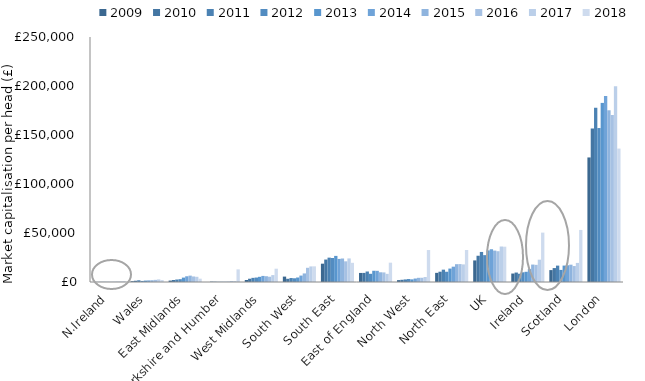
| Category | 2009 | 2010 | 2011 | 2012 | 2013 | 2014 | 2015 | 2016 | 2017 | 2018 |
|---|---|---|---|---|---|---|---|---|---|---|
| N.Ireland | 65.147 | 106.695 | 171.606 | 189.431 | 168.078 | 165.638 | 243.991 | 382.003 | 509.003 | 796.278 |
| Wales | 816.928 | 1279.002 | 1754.933 | 1073.79 | 1450.812 | 1616.719 | 1800.462 | 2183.937 | 2603.581 | 2071.594 |
| East Midlands | 1437.274 | 2060.009 | 2529.461 | 2886.699 | 4488.89 | 5828.681 | 6498.298 | 5657.568 | 5303.295 | 3386.256 |
| Yorkshire and Humber | 23.294 | 365.019 | 301.134 | 199.55 | 225.35 | 238.582 | 356.879 | 810.072 | 844.975 | 12879.517 |
| West Midlands | 2040.75 | 3334.487 | 4219.384 | 4549.246 | 5286.643 | 6204.47 | 5893.586 | 5382.65 | 7044.143 | 13567.196 |
| South West | 5509.842 | 3267.501 | 4042.302 | 3792.403 | 4580.382 | 6548.16 | 8741.04 | 14489.526 | 15886.641 | 15972.71 |
| South East | 18693.593 | 22902.028 | 24858.827 | 24494.706 | 26635.9 | 23560.693 | 23983.063 | 21096.373 | 24053.699 | 19570.17 |
| East of England | 9247.575 | 9275.227 | 10719.456 | 8364.06 | 11469.17 | 11403.456 | 9903.801 | 9779.505 | 8320.921 | 19723.074 |
| North West | 1914.558 | 2262.933 | 2632.129 | 3027.493 | 2678.122 | 3541.312 | 4266.564 | 4321.726 | 5075.707 | 32607.82 |
| North East | 9328.01 | 10506.128 | 12596.53 | 10463.034 | 13705.395 | 15636.171 | 18168.025 | 18283.752 | 17965.082 | 32638.81 |
| UK | 22029.428 | 26788.69 | 30661.695 | 27414.898 | 32230.337 | 33442.313 | 32051.416 | 31410.29 | 36221.798 | 36024.018 |
| Ireland | 8633.659 | 9641.647 | 8434.784 | 9904.911 | 10413.089 | 13166.594 | 17788.005 | 17500.969 | 22768.62 | 50396.741 |
| Scotland | 12151.516 | 14206.141 | 16717.743 | 12327.318 | 16763.665 | 17069.6 | 17674.029 | 16285.838 | 19474.793 | 53105.576 |
| London | 127092.701 | 156554.873 | 177801.853 | 157105.863 | 182749.463 | 189768.1 | 175230.24 | 170391.334 | 199856.528 | 136144.271 |